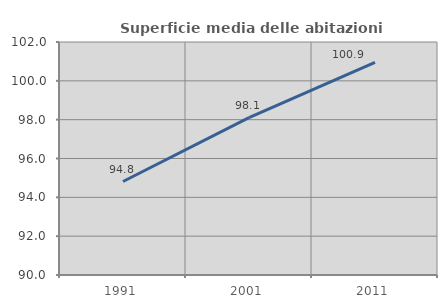
| Category | Superficie media delle abitazioni occupate |
|---|---|
| 1991.0 | 94.814 |
| 2001.0 | 98.103 |
| 2011.0 | 100.95 |